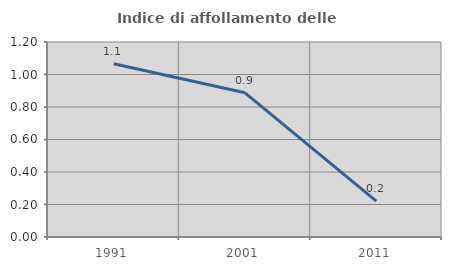
| Category | Indice di affollamento delle abitazioni  |
|---|---|
| 1991.0 | 1.067 |
| 2001.0 | 0.887 |
| 2011.0 | 0.221 |